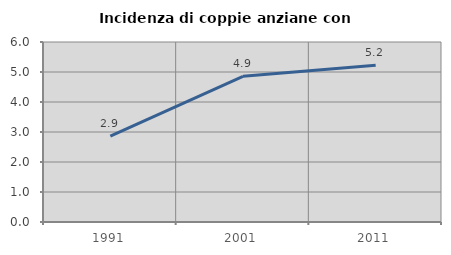
| Category | Incidenza di coppie anziane con figli |
|---|---|
| 1991.0 | 2.86 |
| 2001.0 | 4.857 |
| 2011.0 | 5.225 |